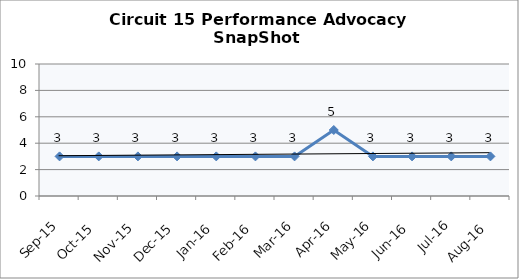
| Category | Circuit 15 |
|---|---|
| Sep-15 | 3 |
| Oct-15 | 3 |
| Nov-15 | 3 |
| Dec-15 | 3 |
| Jan-16 | 3 |
| Feb-16 | 3 |
| Mar-16 | 3 |
| Apr-16 | 5 |
| May-16 | 3 |
| Jun-16 | 3 |
| Jul-16 | 3 |
| Aug-16 | 3 |